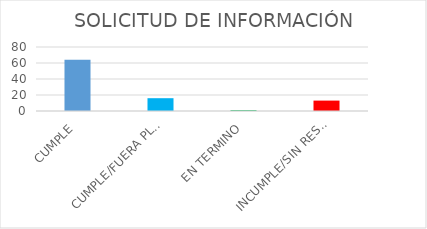
| Category | TOTAL |
|---|---|
| CUMPLE | 64 |
| CUMPLE/FUERA PLAZO | 16 |
| EN TERMINO | 1 |
| INCUMPLE/SIN RESPUESTA | 13 |